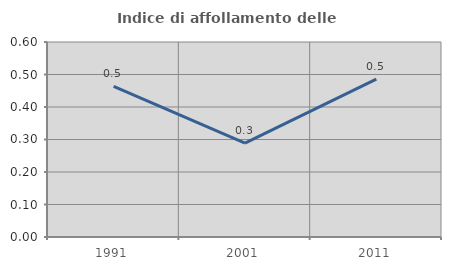
| Category | Indice di affollamento delle abitazioni  |
|---|---|
| 1991.0 | 0.463 |
| 2001.0 | 0.289 |
| 2011.0 | 0.486 |